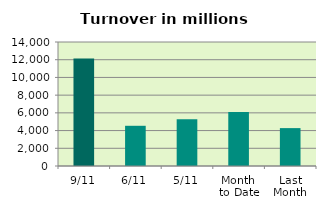
| Category | Series 0 |
|---|---|
| 9/11 | 12147.676 |
| 6/11 | 4539.758 |
| 5/11 | 5270.36 |
| Month 
to Date | 6101.354 |
| Last
Month | 4277.774 |